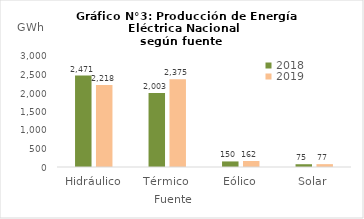
| Category | 2018 | 2019 |
|---|---|---|
| Hidráulico | 2471.451 | 2218.175 |
| Térmico | 2002.833 | 2374.925 |
| Eólico | 150.476 | 162.143 |
| Solar | 74.919 | 77.07 |